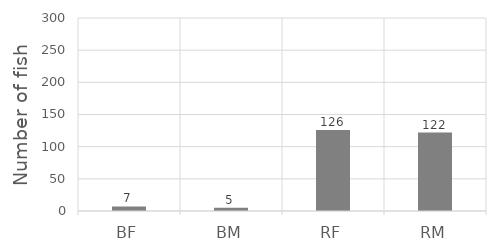
| Category | Series 0 |
|---|---|
| BF | 7 |
| BM | 5 |
| RF | 126 |
| RM | 122 |